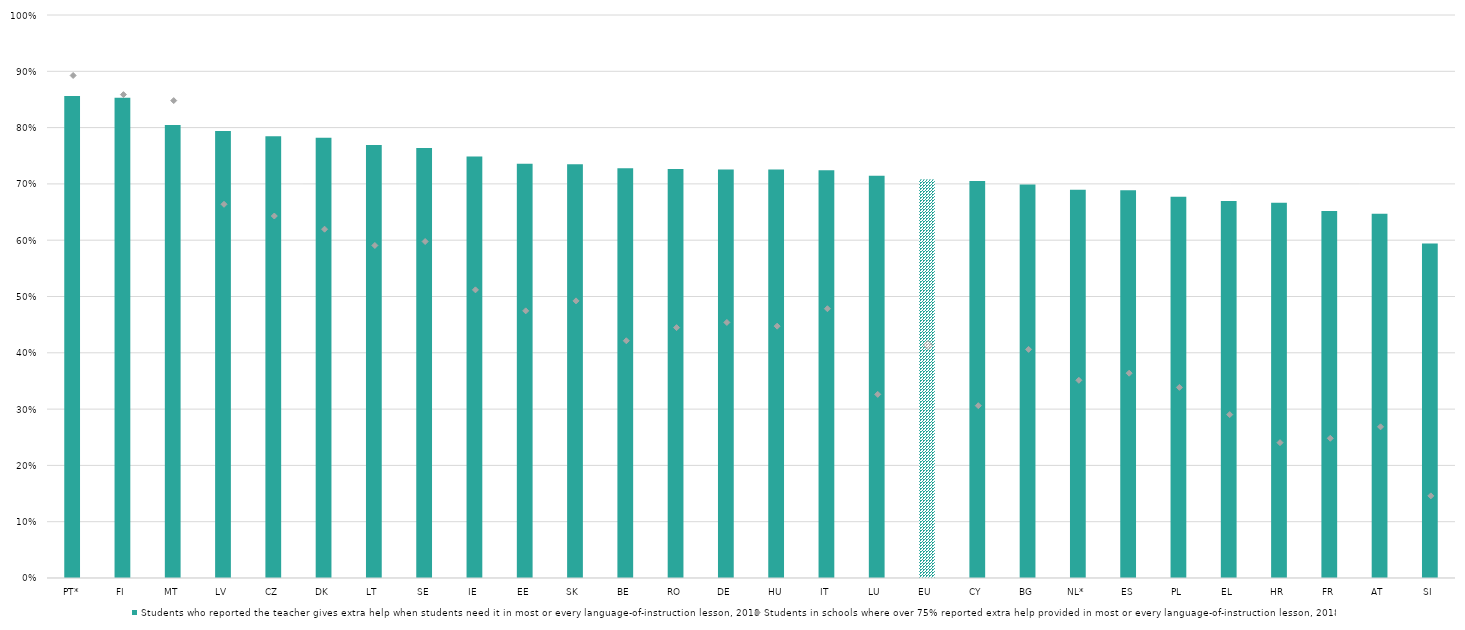
| Category | Students who reported the teacher gives extra help when students need it in most or every language-of-instruction lesson, 2018 |
|---|---|
| PT* | 0.856 |
| FI | 0.853 |
| MT | 0.805 |
| LV | 0.794 |
| CZ | 0.784 |
| DK | 0.782 |
| LT | 0.769 |
| SE | 0.764 |
| IE | 0.748 |
| EE | 0.736 |
| SK | 0.735 |
| BE | 0.728 |
| RO | 0.726 |
| DE | 0.725 |
| HU | 0.725 |
| IT | 0.724 |
| LU | 0.714 |
| EU | 0.708 |
| CY | 0.705 |
| BG | 0.699 |
| NL* | 0.69 |
| ES | 0.689 |
| PL | 0.677 |
| EL | 0.67 |
| HR | 0.666 |
| FR | 0.652 |
| AT | 0.647 |
| SI | 0.594 |